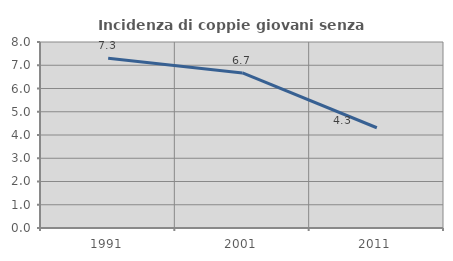
| Category | Incidenza di coppie giovani senza figli |
|---|---|
| 1991.0 | 7.301 |
| 2001.0 | 6.67 |
| 2011.0 | 4.312 |